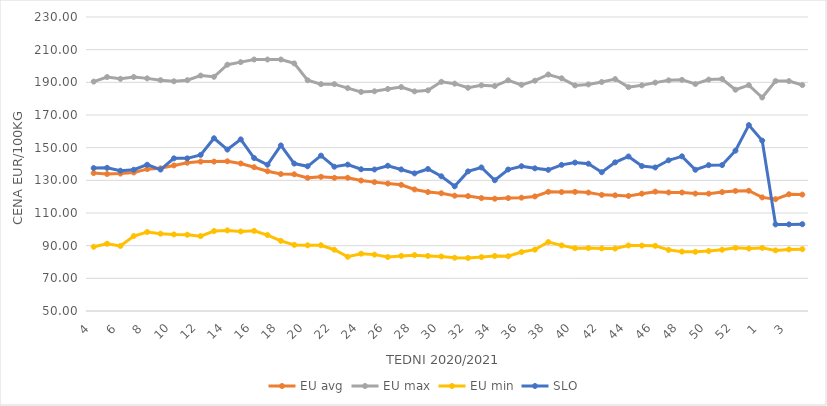
| Category | EU avg | EU max | EU min | SLO |
|---|---|---|---|---|
| 4.0 | 134.43 | 190.45 | 89.3 | 137.5 |
| 5.0 | 133.898 | 193.25 | 91.17 | 137.66 |
| 6.0 | 134.136 | 192.15 | 89.835 | 135.88 |
| 7.0 | 134.799 | 193.24 | 95.88 | 136.47 |
| 8.0 | 136.846 | 192.42 | 98.381 | 139.56 |
| 9.0 | 137.361 | 191.31 | 97.323 | 136.58 |
| 10.0 | 139.118 | 190.63 | 96.874 | 143.45 |
| 11.0 | 140.789 | 191.32 | 96.705 | 143.45 |
| 12.0 | 141.467 | 194.15 | 95.845 | 145.57 |
| 13.0 | 141.466 | 193.4 | 98.945 | 155.76 |
| 14.0 | 141.645 | 200.79 | 99.347 | 148.84 |
| 15.0 | 140.306 | 202.38 | 98.696 | 155.07 |
| 16.0 | 138.046 | 203.97 | 99.065 | 143.65 |
| 17.0 | 135.556 | 203.97 | 96.499 | 139.55 |
| 18.0 | 133.857 | 203.97 | 92.931 | 151.36 |
| 19.0 | 133.702 | 201.59 | 90.48 | 140.27 |
| 20.0 | 131.51 | 191.27 | 90.199 | 138.59 |
| 21.0 | 132.157 | 188.89 | 90.255 | 145.12 |
| 22.0 | 131.509 | 188.89 | 87.513 | 138.33 |
| 23.0 | 131.578 | 186.47 | 83.199 | 139.64 |
| 24.0 | 129.861 | 184.13 | 85.09 | 136.79 |
| 25.0 | 128.899 | 184.51 | 84.52 | 136.65 |
| 26.0 | 128.034 | 185.91 | 83.06 | 138.92 |
| 27.0 | 127.242 | 187.11 | 83.73 | 136.67 |
| 28.0 | 124.426 | 184.46 | 84.2 | 134.25 |
| 29.0 | 122.822 | 185.09 | 83.72 | 136.94 |
| 30.0 | 122.086 | 190.31 | 83.4 | 132.48 |
| 31.0 | 120.581 | 189.19 | 82.63 | 126.34 |
| 32.0 | 120.341 | 186.67 | 82.46 | 135.48 |
| 33.0 | 119.127 | 188.18 | 82.99 | 137.89 |
| 34.0 | 118.75 | 187.74 | 83.66 | 130.07 |
| 35.0 | 119.136 | 191.25 | 83.53 | 136.63 |
| 36.0 | 119.398 | 188.47 | 86.09 | 138.64 |
| 37.0 | 120.135 | 190.99 | 87.57 | 137.35 |
| 38.0 | 122.982 | 194.8 | 92.21 | 136.42 |
| 39.0 | 122.832 | 192.45 | 90.16 | 139.46 |
| 40.0 | 122.936 | 188.11 | 88.45 | 140.87 |
| 41.0 | 122.507 | 188.73 | 88.54 | 140.18 |
| 42.0 | 121.098 | 190.2 | 88.3 | 134.98 |
| 43.0 | 120.822 | 191.99 | 88.22 | 141 |
| 44.0 | 120.448 | 187.06 | 90.13 | 144.61 |
| 45.0 | 121.843 | 188.15 | 90.04 | 138.73 |
| 46.0 | 123.07 | 189.82 | 89.89 | 137.88 |
| 47.0 | 122.58 | 191.22 | 87.43 | 142.27 |
| 48.0 | 122.553 | 191.52 | 86.35 | 144.69 |
| 49.0 | 121.893 | 188.97 | 86.24 | 136.47 |
| 50.0 | 121.851 | 191.67 | 86.72 | 139.29 |
| 51.0 | 122.8 | 192.06 | 87.5 | 139.35 |
| 52.0 | 123.52 | 185.468 | 88.67 | 148.16 |
| 53.0 | 123.611 | 188.25 | 88.23 | 163.81 |
| 1.0 | 119.553 | 180.72 | 88.64 | 154.31 |
| 2.0 | 118.487 | 190.77 | 87.1 | 103.02 |
| 3.0 | 121.47 | 190.76 | 87.7 | 103.03 |
| 4.0 | 121.265 | 188.33 | 87.88 | 103.15 |